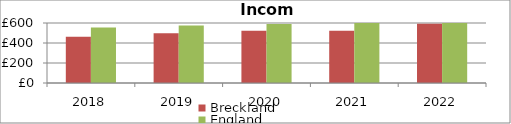
| Category | Breckland | England |
|---|---|---|
| 2018.0 | 463 | 556 |
| 2019.0 | 498 | 575 |
| 2020.0 | 522 | 590 |
| 2021.0 | 523 | 613 |
| 2022.0 | 593.692 | 645.808 |